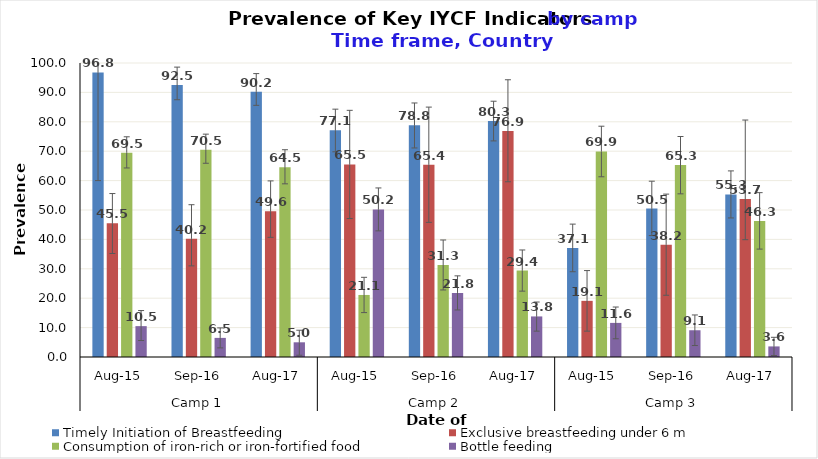
| Category | Timely Initiation of Breastfeeding | Exclusive breastfeeding under 6 m | Consumption of iron-rich or iron-fortified food | Bottle feeding |
|---|---|---|---|---|
| 0 | 96.8 | 45.5 | 69.5 | 10.5 |
| 1 | 92.5 | 40.2 | 70.5 | 6.5 |
| 2 | 90.2 | 49.6 | 64.5 | 5 |
| 3 | 77.1 | 65.5 | 21.1 | 50.2 |
| 4 | 78.8 | 65.4 | 31.3 | 21.8 |
| 5 | 80.3 | 76.9 | 29.4 | 13.8 |
| 6 | 37.1 | 19.1 | 69.9 | 11.6 |
| 7 | 50.5 | 38.2 | 65.3 | 9.1 |
| 8 | 55.3 | 53.7 | 46.3 | 3.6 |